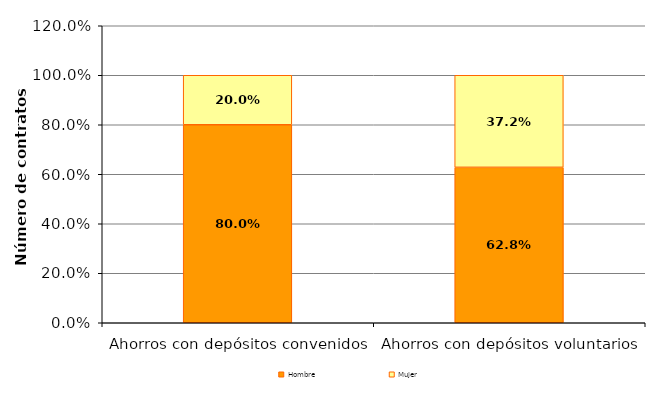
| Category | Hombre | Mujer |
|---|---|---|
| Ahorros con depósitos convenidos | 0.8 | 0.2 |
| Ahorros con depósitos voluntarios | 0.628 | 0.372 |